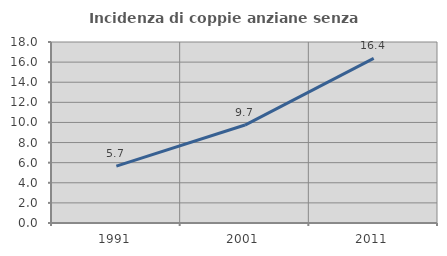
| Category | Incidenza di coppie anziane senza figli  |
|---|---|
| 1991.0 | 5.661 |
| 2001.0 | 9.741 |
| 2011.0 | 16.37 |